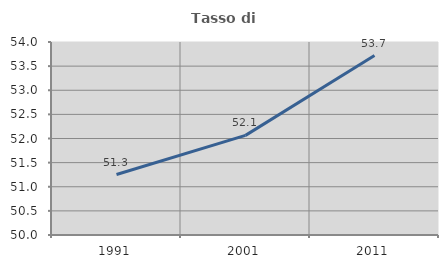
| Category | Tasso di occupazione   |
|---|---|
| 1991.0 | 51.254 |
| 2001.0 | 52.065 |
| 2011.0 | 53.718 |